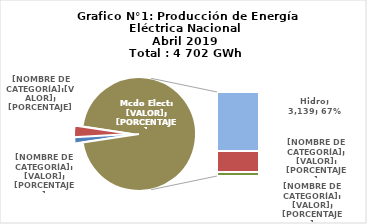
| Category | Series 0 |
|---|---|
| 0 | 71.092 |
| 1 | 154.597 |
| 2 | 3138.697 |
| 3 | 1130.668 |
| 4 | 206.8 |